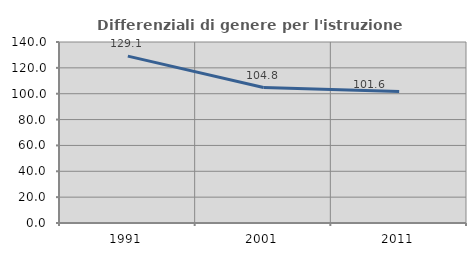
| Category | Differenziali di genere per l'istruzione superiore |
|---|---|
| 1991.0 | 129.096 |
| 2001.0 | 104.773 |
| 2011.0 | 101.628 |